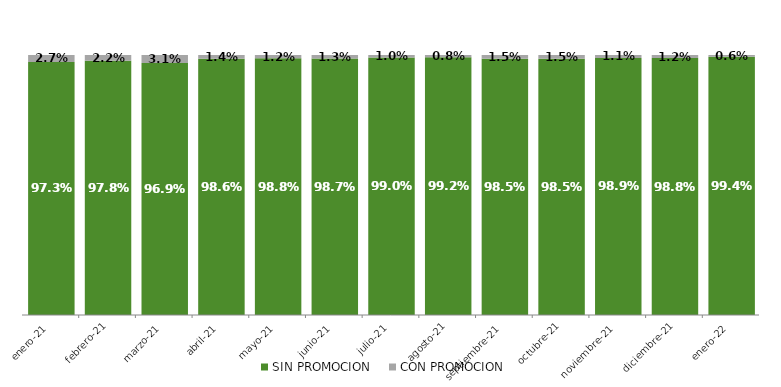
| Category | SIN PROMOCION   | CON PROMOCION   |
|---|---|---|
| 2021-01-01 | 0.973 | 0.027 |
| 2021-02-01 | 0.978 | 0.022 |
| 2021-03-01 | 0.969 | 0.031 |
| 2021-04-01 | 0.986 | 0.014 |
| 2021-05-01 | 0.988 | 0.012 |
| 2021-06-01 | 0.987 | 0.013 |
| 2021-07-01 | 0.99 | 0.01 |
| 2021-08-01 | 0.992 | 0.008 |
| 2021-09-01 | 0.985 | 0.015 |
| 2021-10-01 | 0.985 | 0.015 |
| 2021-11-01 | 0.989 | 0.011 |
| 2021-12-01 | 0.988 | 0.012 |
| 2022-01-01 | 0.994 | 0.006 |